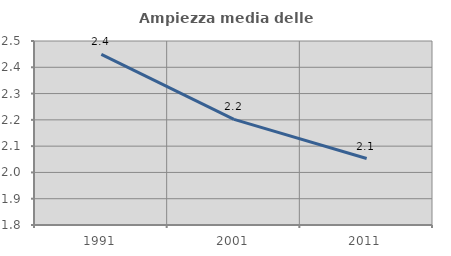
| Category | Ampiezza media delle famiglie |
|---|---|
| 1991.0 | 2.449 |
| 2001.0 | 2.202 |
| 2011.0 | 2.053 |